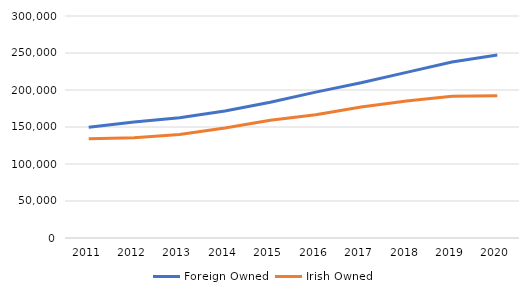
| Category | Foreign Owned | Irish Owned |
|---|---|---|
| 2011.0 | 149697 | 134147 |
| 2012.0 | 156902 | 135405 |
| 2013.0 | 162536 | 139803 |
| 2014.0 | 171588 | 148565 |
| 2015.0 | 183478 | 159017 |
| 2016.0 | 197131 | 166601 |
| 2017.0 | 209763 | 176938 |
| 2018.0 | 223842 | 185146 |
| 2019.0 | 237745 | 191554 |
| 2020.0 | 247195 | 192187 |